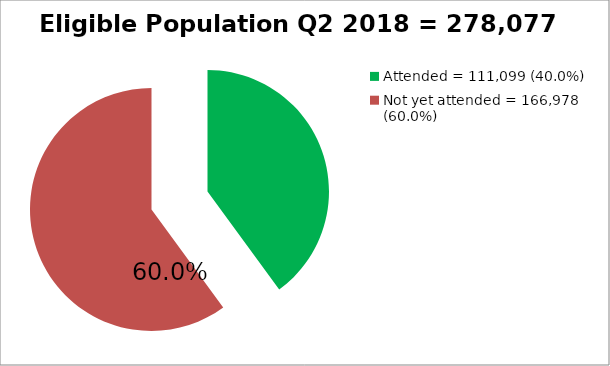
| Category | Eligible Population Q2 2018= 274,607 |
|---|---|
| Attended = 111,099 (40.0%) | 111099 |
| Not yet attended = 166,978 (60.0%)  | 166978 |